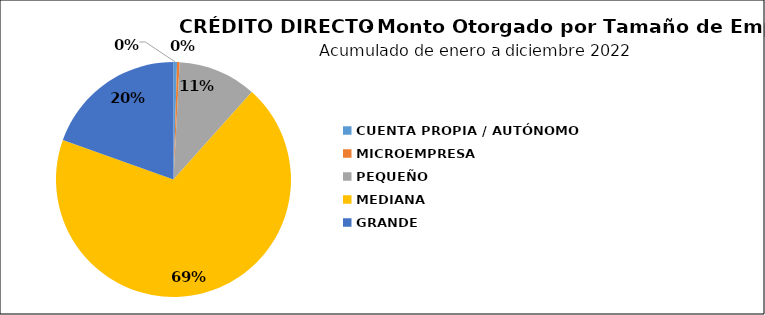
| Category | Monto | Créditos |
|---|---|---|
| CUENTA PROPIA / AUTÓNOMO | 0.252 | 1 |
| MICROEMPRESA | 0.184 | 3 |
| PEQUEÑO | 5.595 | 15 |
| MEDIANA | 35.755 | 11 |
| GRANDE | 10.145 | 6 |